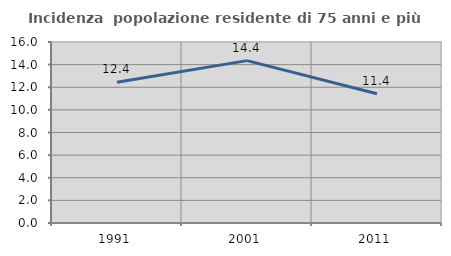
| Category | Incidenza  popolazione residente di 75 anni e più |
|---|---|
| 1991.0 | 12.446 |
| 2001.0 | 14.355 |
| 2011.0 | 11.419 |